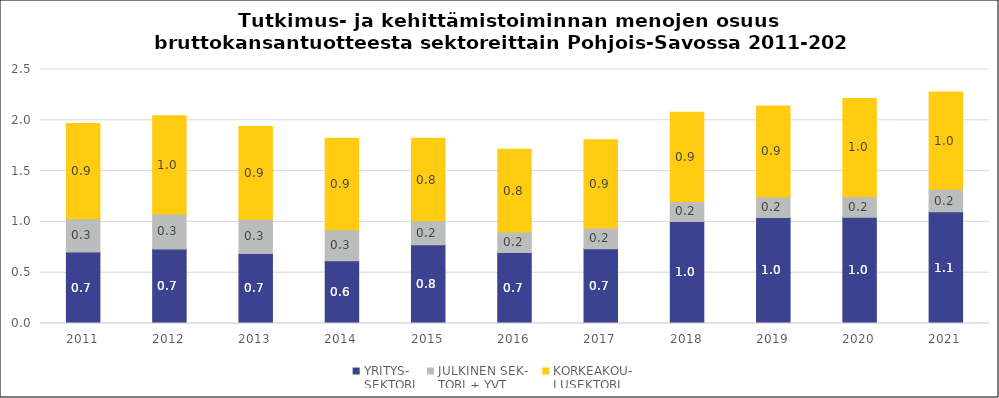
| Category | YRITYS-
SEKTORI | JULKINEN SEK-
TORI + YVT | KORKEAKOU-
LUSEKTORI |
|---|---|---|---|
| 2011.0 | 0.704 | 0.328 | 0.936 |
| 2012.0 | 0.734 | 0.343 | 0.967 |
| 2013.0 | 0.69 | 0.337 | 0.912 |
| 2014.0 | 0.618 | 0.304 | 0.902 |
| 2015.0 | 0.774 | 0.236 | 0.814 |
| 2016.0 | 0.7 | 0.2 | 0.814 |
| 2017.0 | 0.736 | 0.204 | 0.869 |
| 2018.0 | 1.004 | 0.197 | 0.879 |
| 2019.0 | 1.044 | 0.202 | 0.895 |
| 2020.0 | 1.046 | 0.205 | 0.964 |
| 2021.0 | 1.099 | 0.221 | 0.959 |